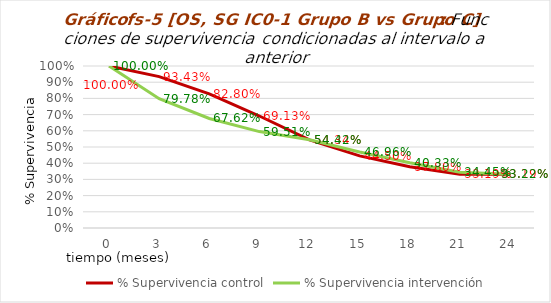
| Category | % Supervivencia control | % Supervivencia intervención |
|---|---|---|
| 0.0 | 1 | 1 |
| 3.0 | 0.934 | 0.798 |
| 6.0 | 0.828 | 0.676 |
| 9.0 | 0.691 | 0.595 |
| 12.0 | 0.543 | 0.544 |
| 15.0 | 0.445 | 0.47 |
| 18.0 | 0.378 | 0.403 |
| 21.0 | 0.332 | 0.344 |
| 24.0 | 0.332 | 0.332 |